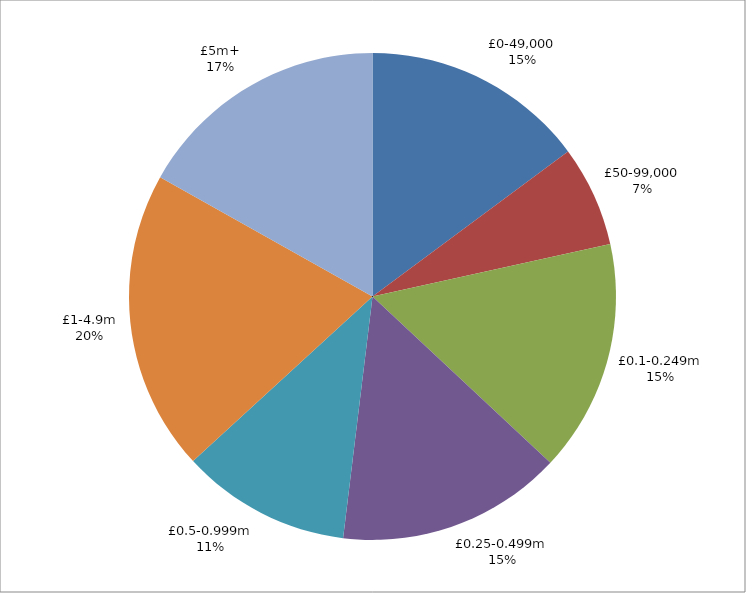
| Category | Series 0 |
|---|---|
| £0-49,000 | 485 |
| £50-99,000 | 219 |
| £0.1-0.249m | 504 |
| £0.25-0.499m | 489 |
| £0.5-0.999m | 368 |
| £1-4.9m | 652 |
| £5m+ | 551 |